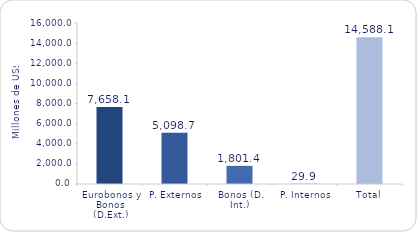
| Category | Series 1 |
|---|---|
| Eurobonos y Bonos (D.Ext.) | 7658.1 |
| P. Externos | 5098.7 |
| Bonos (D. Int.) | 1801.4 |
| P. Internos | 29.9 |
| Total | 14588.1 |